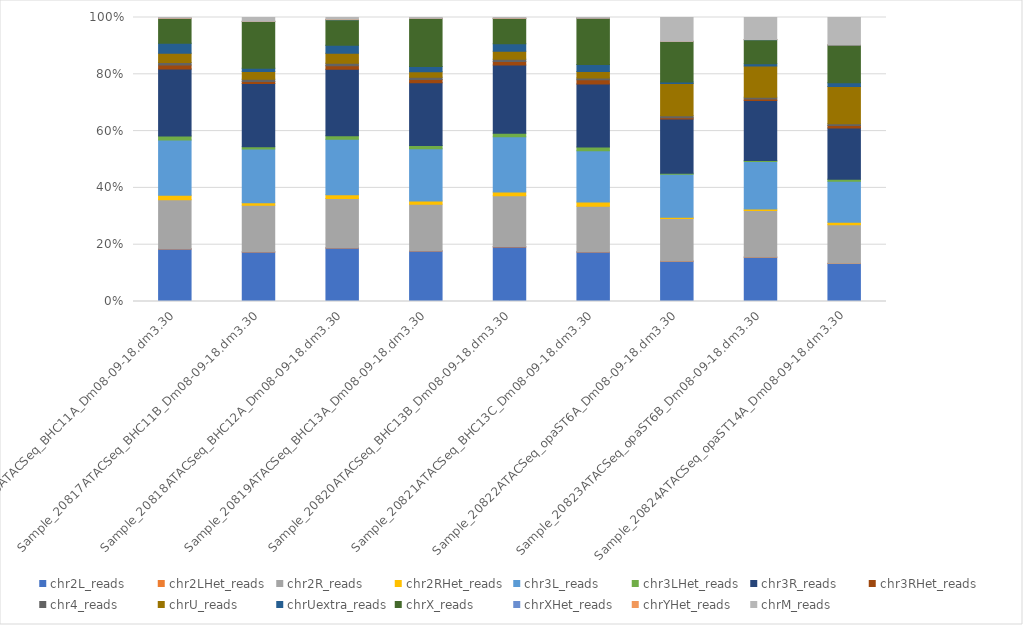
| Category | chr2L_reads | chr2LHet_reads | chr2R_reads | chr2RHet_reads | chr3L_reads | chr3LHet_reads | chr3R_reads | chr3RHet_reads | chr4_reads | chrU_reads | chrUextra_reads | chrX_reads | chrXHet_reads | chrYHet_reads | chrM_reads |
|---|---|---|---|---|---|---|---|---|---|---|---|---|---|---|---|
| Sample_20816ATACSeq_BHC11A_Dm08-09-18.dm3.30 | 2912583 | 20740 | 2721227 | 238869 | 3068993 | 226978 | 3719327 | 222092 | 140711 | 517413 | 544484 | 1376141 | 10262 | 15078 | 33126 |
| Sample_20817ATACSeq_BHC11B_Dm08-09-18.dm3.30 | 2017057 | 9041 | 1896246 | 101536 | 2191608 | 91076 | 2570996 | 85072 | 87747 | 317456 | 132379 | 1905088 | 11005 | 405 | 152561 |
| Sample_20818ATACSeq_BHC12A_Dm08-09-18.dm3.30 | 1420881 | 8849 | 1307757 | 102071 | 1469949 | 94884 | 1768341 | 93065 | 67720 | 261357 | 212110 | 678963 | 4443 | 6125 | 49304 |
| Sample_20819ATACSeq_BHC13A_Dm08-09-18.dm3.30 | 1561426 | 9679 | 1433571 | 106450 | 1612149 | 98450 | 1943642 | 96121 | 75091 | 171379 | 160472 | 1479414 | 10340 | 368 | 23671 |
| Sample_20820ATACSeq_BHC13B_Dm08-09-18.dm3.30 | 3347753 | 20842 | 3124701 | 232199 | 3394177 | 214758 | 4184636 | 210352 | 136184 | 500592 | 451308 | 1555377 | 10774 | 14427 | 34748 |
| Sample_20821ATACSeq_BHC13C_Dm08-09-18.dm3.30 | 2046243 | 15070 | 1882712 | 172440 | 2118099 | 163224 | 2606466 | 169068 | 76198 | 274929 | 281845 | 1913179 | 14218 | 555 | 20725 |
| Sample_20822ATACSeq_opaST6A_Dm08-09-18.dm3.30 | 2373639 | 6385 | 2502619 | 67164 | 2530350 | 56601 | 3202415 | 68090 | 114054 | 1905645 | 85463 | 2382523 | 13330 | 431 | 1393709 |
| Sample_20823ATACSeq_opaST6B_Dm08-09-18.dm3.30 | 3603842 | 9719 | 3787612 | 107102 | 3858639 | 93058 | 4878175 | 109529 | 151622 | 2531226 | 183380 | 1966881 | 10184 | 6960 | 1781006 |
| Sample_20824ATACSeq_opaST14A_Dm08-09-18.dm3.30 | 2161245 | 12737 | 2180242 | 141879 | 2325666 | 122347 | 2902948 | 142322 | 91416 | 2123780 | 213373 | 2137037 | 12428 | 691 | 1548702 |